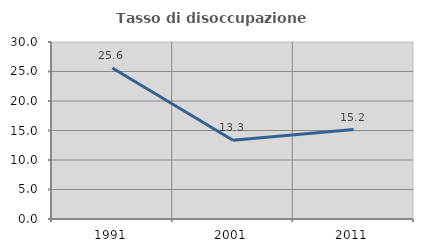
| Category | Tasso di disoccupazione giovanile  |
|---|---|
| 1991.0 | 25.581 |
| 2001.0 | 13.333 |
| 2011.0 | 15.152 |